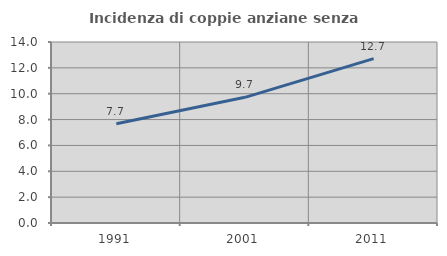
| Category | Incidenza di coppie anziane senza figli  |
|---|---|
| 1991.0 | 7.681 |
| 2001.0 | 9.72 |
| 2011.0 | 12.713 |